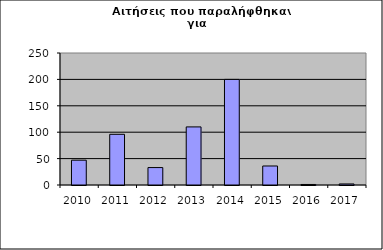
| Category | Series 0 |
|---|---|
| 2010.0 | 47 |
| 2011.0 | 96 |
| 2012.0 | 33 |
| 2013.0 | 110 |
| 2014.0 | 200 |
| 2015.0 | 36 |
| 2016.0 | 1 |
| 2017.0 | 2 |